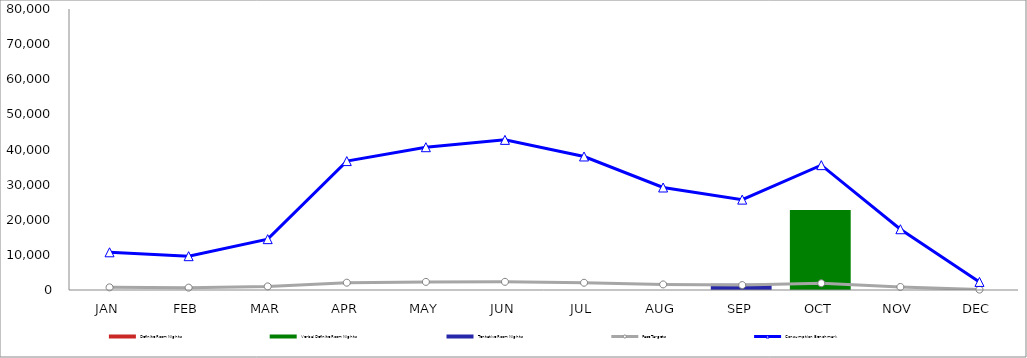
| Category | Definite Room Nights | Verbal Definite Room Nights | Tentative Room Nights |
|---|---|---|---|
| JAN | 0 | 0 | 0 |
| FEB | 0 | 0 | 0 |
| MAR | 0 | 0 | 0 |
| APR | 0 | 0 | 0 |
| MAY | 0 | 0 | 0 |
| JUN | 0 | 0 | 0 |
| JUL | 0 | 0 | 0 |
| AUG | 0 | 0 | 0 |
| SEP | 0 | 0 | 1750 |
| OCT | 0 | 22743 | 0 |
| NOV | 0 | 0 | 0 |
| DEC | 0 | 0 | 0 |